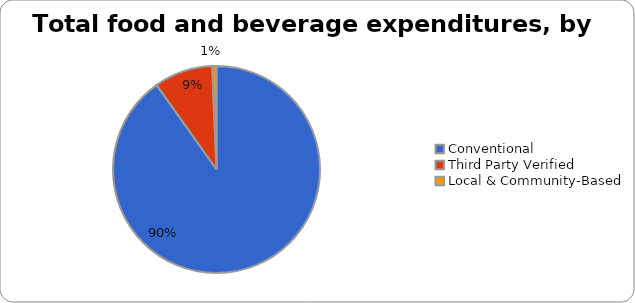
| Category | Series 0 |
|---|---|
| Conventional | 0.902 |
| Third Party Verified | 0.092 |
| Local & Community-Based | 0.007 |